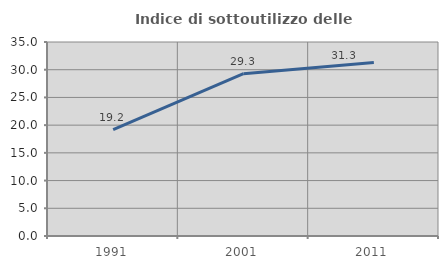
| Category | Indice di sottoutilizzo delle abitazioni  |
|---|---|
| 1991.0 | 19.184 |
| 2001.0 | 29.278 |
| 2011.0 | 31.321 |